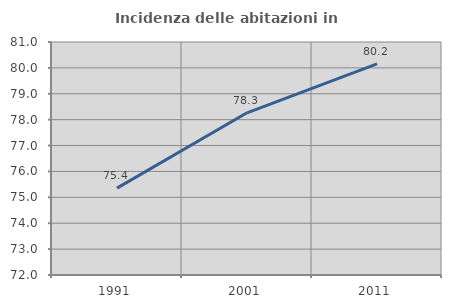
| Category | Incidenza delle abitazioni in proprietà  |
|---|---|
| 1991.0 | 75.356 |
| 2001.0 | 78.265 |
| 2011.0 | 80.152 |